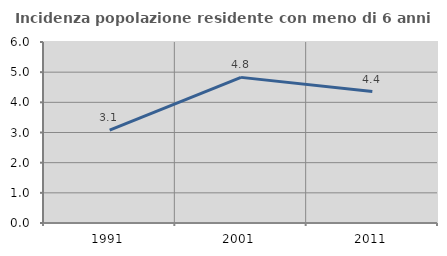
| Category | Incidenza popolazione residente con meno di 6 anni |
|---|---|
| 1991.0 | 3.077 |
| 2001.0 | 4.828 |
| 2011.0 | 4.359 |